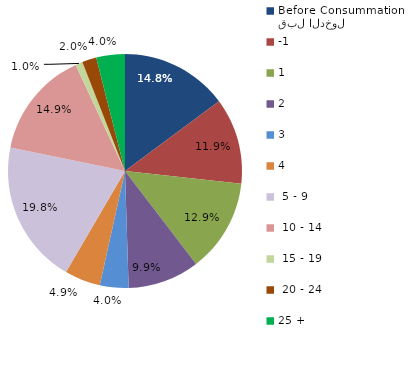
| Category | Series 0 |
|---|---|
| قبل الدخول
Before Consummation | 14.851 |
| -1 | 11.881 |
| 1 | 12.871 |
| 2 | 9.901 |
| 3 | 3.96 |
| 4 | 4.95 |
|  5 - 9 | 19.802 |
|  10 - 14 | 14.851 |
|  15 - 19 | 0.99 |
|  20 - 24 | 1.98 |
| 25 + | 3.96 |